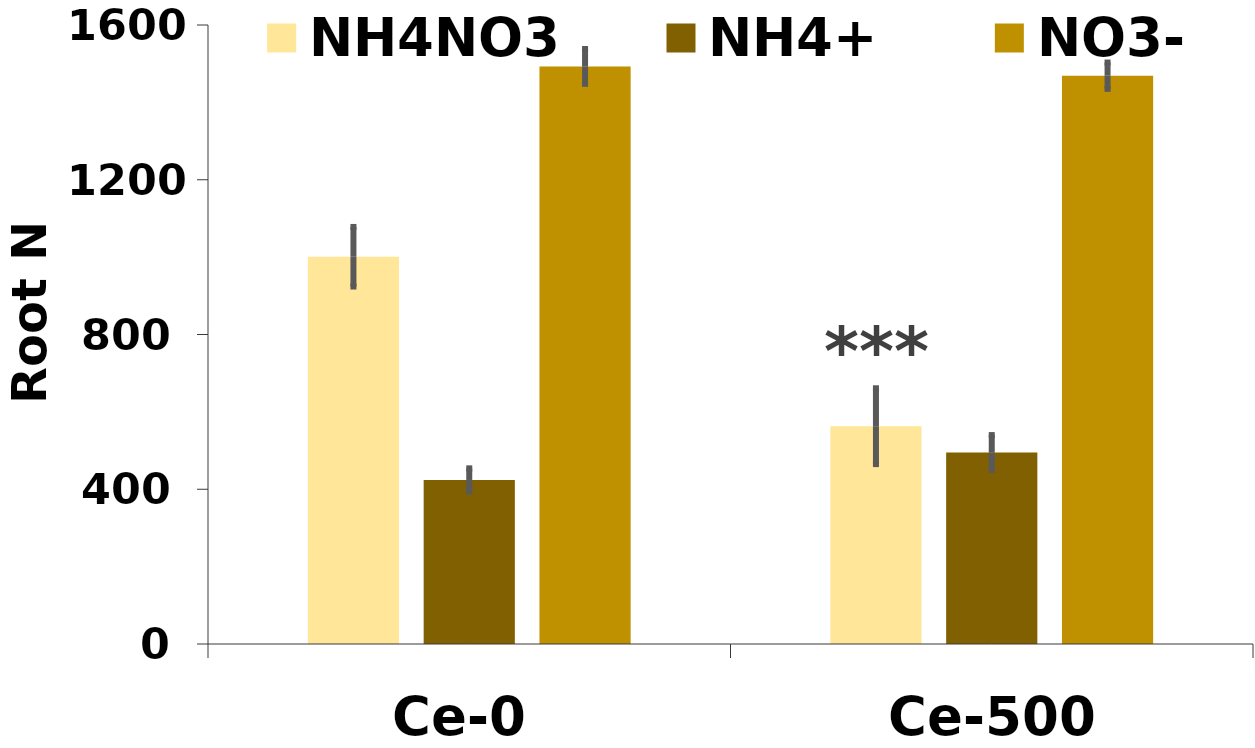
| Category | NH4NO3 | NH4+ | NO3- |
|---|---|---|---|
| Ce-0 | 1001 | 424 | 1493 |
| Ce-500 | 563 | 495 | 1469 |